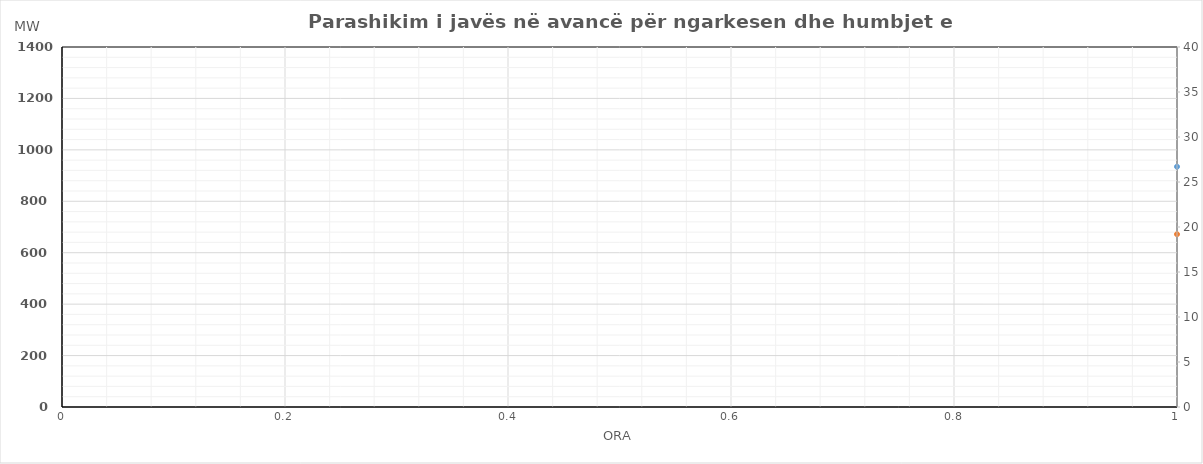
| Category | Ngarkesa (MWh) |
|---|---|
| 0 | 672.032 |
| 1 | 565.844 |
| 2 | 520.769 |
| 3 | 504.189 |
| 4 | 509.873 |
| 5 | 557.316 |
| 6 | 710.184 |
| 7 | 895.035 |
| 8 | 1065.221 |
| 9 | 1107.149 |
| 10 | 1074.092 |
| 11 | 1031.424 |
| 12 | 1028.711 |
| 13 | 1033.062 |
| 14 | 1036.637 |
| 15 | 1049.947 |
| 16 | 1116.827 |
| 17 | 1246.542 |
| 18 | 1265.087 |
| 19 | 1235.572 |
| 20 | 1206.467 |
| 21 | 1103.751 |
| 22 | 974.927 |
| 23 | 786.528 |
| 24 | 655.049 |
| 25 | 565.564 |
| 26 | 520.487 |
| 27 | 511.851 |
| 28 | 520.362 |
| 29 | 572.647 |
| 30 | 725.442 |
| 31 | 946.074 |
| 32 | 1090.202 |
| 33 | 1113.962 |
| 34 | 1077.363 |
| 35 | 1036.514 |
| 36 | 1023.855 |
| 37 | 1037.031 |
| 38 | 1040.748 |
| 39 | 1056.295 |
| 40 | 1130.088 |
| 41 | 1246.066 |
| 42 | 1262.476 |
| 43 | 1247.367 |
| 44 | 1201.895 |
| 45 | 1100.429 |
| 46 | 949.408 |
| 47 | 768.64 |
| 48 | 642.352 |
| 49 | 574.675 |
| 50 | 542.211 |
| 51 | 533.741 |
| 52 | 540.203 |
| 53 | 599.431 |
| 54 | 740.684 |
| 55 | 958.778 |
| 56 | 1100.053 |
| 57 | 1110.834 |
| 58 | 1055.203 |
| 59 | 1024.897 |
| 60 | 1007.964 |
| 61 | 1010.388 |
| 62 | 1025.331 |
| 63 | 1043.044 |
| 64 | 1127.334 |
| 65 | 1254.742 |
| 66 | 1263.651 |
| 67 | 1251.985 |
| 68 | 1214.259 |
| 69 | 1102.595 |
| 70 | 964.041 |
| 71 | 811.392 |
| 72 | 670.712 |
| 73 | 581.873 |
| 74 | 549.269 |
| 75 | 533.997 |
| 76 | 542.362 |
| 77 | 593.728 |
| 78 | 716.63 |
| 79 | 920.22 |
| 80 | 1054.876 |
| 81 | 1074.791 |
| 82 | 1030.64 |
| 83 | 1004.08 |
| 84 | 989.045 |
| 85 | 991.13 |
| 86 | 1007.32 |
| 87 | 1031.564 |
| 88 | 1125.581 |
| 89 | 1266.183 |
| 90 | 1279.321 |
| 91 | 1273.388 |
| 92 | 1235.809 |
| 93 | 1116.874 |
| 94 | 963.348 |
| 95 | 785.601 |
| 96 | 627.652 |
| 97 | 560.12 |
| 98 | 527.829 |
| 99 | 514.84 |
| 100 | 514.832 |
| 101 | 573.974 |
| 102 | 749.959 |
| 103 | 986.672 |
| 104 | 1098.596 |
| 105 | 1112.619 |
| 106 | 1104.092 |
| 107 | 1096.179 |
| 108 | 1092.512 |
| 109 | 1126.65 |
| 110 | 1166.065 |
| 111 | 1169.973 |
| 112 | 1221.172 |
| 113 | 1286.558 |
| 114 | 1264.189 |
| 115 | 1246.972 |
| 116 | 1226.831 |
| 117 | 1111.439 |
| 118 | 951.159 |
| 119 | 789.364 |
| 120 | 669.092 |
| 121 | 579.896 |
| 122 | 546.335 |
| 123 | 529.62 |
| 124 | 532.943 |
| 125 | 584.764 |
| 126 | 717.42 |
| 127 | 916.239 |
| 128 | 1051.378 |
| 129 | 1083.028 |
| 130 | 1072.494 |
| 131 | 1052.914 |
| 132 | 1044.699 |
| 133 | 1062.493 |
| 134 | 1086.768 |
| 135 | 1103.941 |
| 136 | 1183.061 |
| 137 | 1289.173 |
| 138 | 1285.283 |
| 139 | 1278.987 |
| 140 | 1248.074 |
| 141 | 1131.521 |
| 142 | 964.275 |
| 143 | 786.069 |
| 144 | 661.452 |
| 145 | 582.586 |
| 146 | 548.53 |
| 147 | 536.754 |
| 148 | 539.839 |
| 149 | 595.862 |
| 150 | 725.204 |
| 151 | 919.581 |
| 152 | 1072.946 |
| 153 | 1104.276 |
| 154 | 1081.257 |
| 155 | 1052.099 |
| 156 | 1039.712 |
| 157 | 1049.673 |
| 158 | 1065.131 |
| 159 | 1082.406 |
| 160 | 1165.758 |
| 161 | 1279.039 |
| 162 | 1280.16 |
| 163 | 1273.592 |
| 164 | 1237.146 |
| 165 | 1127.283 |
| 166 | 971.526 |
| 167 | 810.213 |